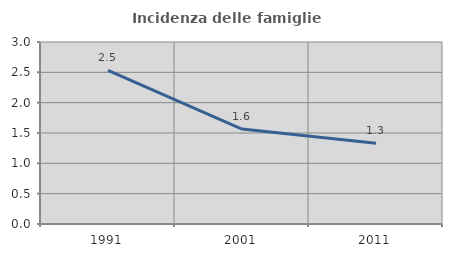
| Category | Incidenza delle famiglie numerose |
|---|---|
| 1991.0 | 2.532 |
| 2001.0 | 1.565 |
| 2011.0 | 1.332 |